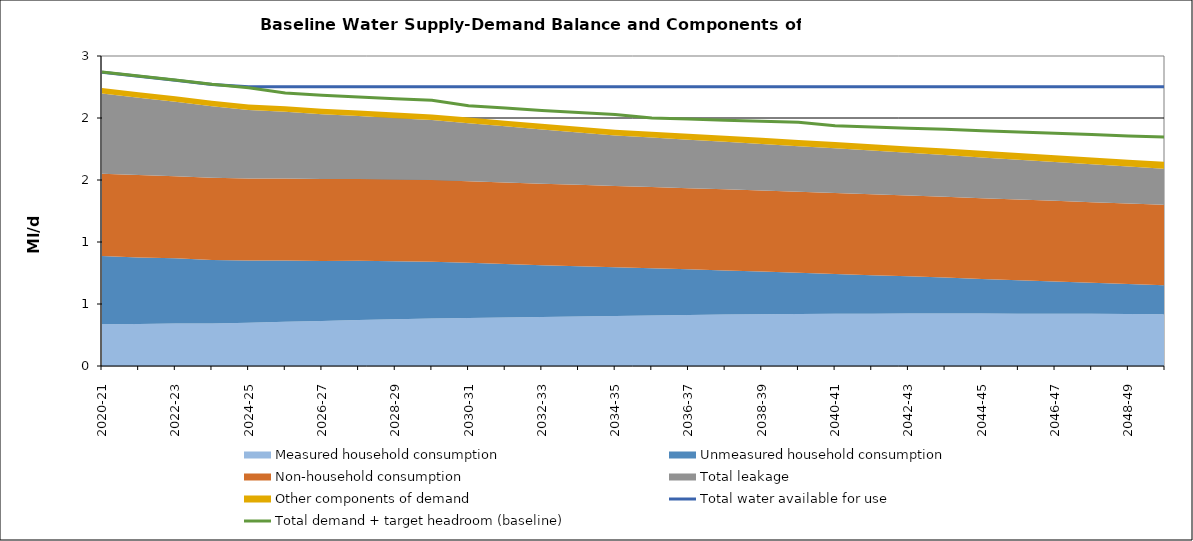
| Category | Total water available for use | Total demand + target headroom (baseline) |
|---|---|---|
| 2020-21 | 2.369 | 2.37 |
| 2021-22 | 2.337 | 2.339 |
| 2022-23 | 2.304 | 2.307 |
| 2023-24 | 2.27 | 2.271 |
| 2024-25 | 2.253 | 2.244 |
| 2025-26 | 2.253 | 2.202 |
| 2026-27 | 2.253 | 2.184 |
| 2027-28 | 2.253 | 2.17 |
| 2028-29 | 2.253 | 2.156 |
| 2029-30 | 2.253 | 2.142 |
| 2030-31 | 2.253 | 2.1 |
| 2031-32 | 2.253 | 2.08 |
| 2032-33 | 2.253 | 2.061 |
| 2033-34 | 2.253 | 2.044 |
| 2034-35 | 2.253 | 2.028 |
| 2035-36 | 2.253 | 2.001 |
| 2036-37 | 2.253 | 1.992 |
| 2037-38 | 2.253 | 1.982 |
| 2038-39 | 2.253 | 1.973 |
| 2039-40 | 2.253 | 1.965 |
| 2040-41 | 2.253 | 1.937 |
| 2041-42 | 2.253 | 1.927 |
| 2042-43 | 2.253 | 1.918 |
| 2043-44 | 2.253 | 1.909 |
| 2044-45 | 2.253 | 1.898 |
| 2045-46 | 2.253 | 1.887 |
| 2046-47 | 2.253 | 1.876 |
| 2047-48 | 2.253 | 1.867 |
| 2048-49 | 2.253 | 1.855 |
| 2049-50 | 2.253 | 1.847 |